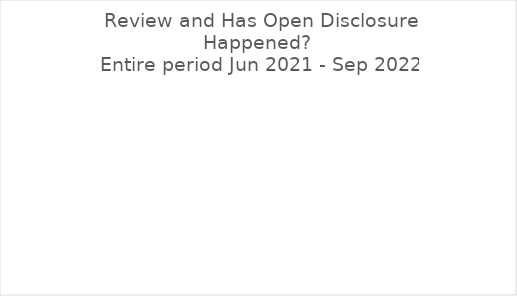
| Category | Series 0 |
|---|---|
| Yes | 0 |
| No | 0 |
| empty | 0 |